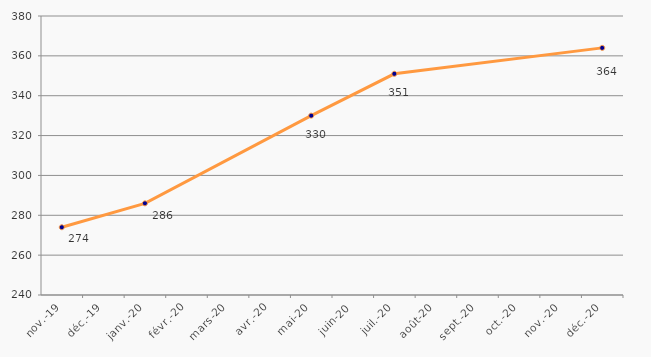
| Category | Nombre de conseillers en accompagnement personnalisé |
|---|---|
| 2019-11-01 | 274 |
| 2020-01-01 | 286 |
| 2020-05-01 | 330 |
| 2020-07-01 | 351 |
| 2020-12-01 | 364 |